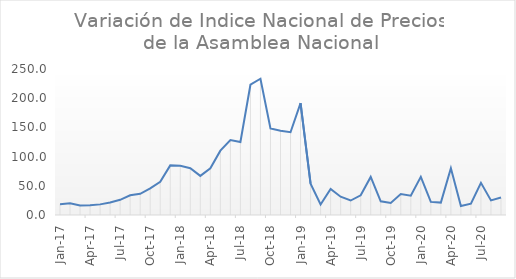
| Category | Series 0 |
|---|---|
| 2017-01-01 | 18.6 |
| 2017-02-01 | 20.1 |
| 2017-03-01 | 16.2 |
| 2017-04-01 | 16.5 |
| 2017-05-01 | 18.2 |
| 2017-06-01 | 21.4 |
| 2017-07-01 | 26 |
| 2017-08-01 | 33.8 |
| 2017-09-01 | 36.3 |
| 2017-10-01 | 45.5 |
| 2017-11-01 | 56.7 |
| 2017-12-01 | 85 |
| 2018-01-01 | 84.2 |
| 2018-02-01 | 80.03 |
| 2018-03-01 | 67 |
| 2018-04-01 | 80.1 |
| 2018-05-01 | 110.14 |
| 2018-06-01 | 128.4 |
| 2018-07-01 | 125 |
| 2018-08-01 | 223.1 |
| 2018-09-01 | 233.3 |
| 2018-10-01 | 148.2 |
| 2018-11-01 | 144.2 |
| 2018-12-01 | 141.75 |
| 2019-01-01 | 191.6 |
| 2019-02-01 | 53.7 |
| 2019-03-01 | 18.1 |
| 2019-04-01 | 44.7 |
| 2019-05-01 | 31.3 |
| 2019-06-01 | 24.8 |
| 2019-07-01 | 33.8 |
| 2019-08-01 | 65.2 |
| 2019-09-01 | 23.5 |
| 2019-10-01 | 20.7 |
| 2019-11-01 | 35.8 |
| 2019-12-01 | 33.1 |
| 2020-01-01 | 65.4 |
| 2020-02-01 | 22.4 |
| 2020-03-01 | 21.2 |
| 2020-04-01 | 79.98 |
| 2020-05-01 | 15.3 |
| 2020-06-01 | 19.5 |
| 2020-07-01 | 55.05 |
| 2020-08-01 | 25.04 |
| 2020-09-01 | 30 |